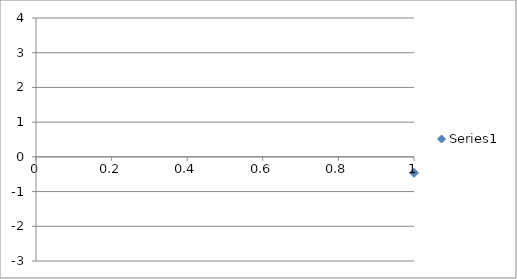
| Category | Series 0 |
|---|---|
| 0 | -0.462 |
| 1 | 0.868 |
| 2 | 0.407 |
| 3 | 1.125 |
| 4 | 1.55 |
| 5 | 0.694 |
| 6 | -1.523 |
| 7 | -0.655 |
| 8 | 1.197 |
| 9 | -0.394 |
| 10 | 1.809 |
| 11 | 0.55 |
| 12 | -0.166 |
| 13 | 0.722 |
| 14 | 0.797 |
| 15 | -1.389 |
| 16 | 0.056 |
| 17 | -1.054 |
| 18 | -0.023 |
| 19 | 0.354 |
| 20 | -0.777 |
| 21 | -1.164 |
| 22 | 0.889 |
| 23 | -0.77 |
| 24 | 0.294 |
| 25 | 0.736 |
| 26 | -0.223 |
| 27 | -1.757 |
| 28 | 0.368 |
| 29 | -0.163 |
| 30 | 1.318 |
| 31 | -1.282 |
| 32 | -0.451 |
| 33 | -1.438 |
| 34 | 0.211 |
| 35 | -0.2 |
| 36 | 3.046 |
| 37 | 0.91 |
| 38 | 0.356 |
| 39 | -1.535 |
| 40 | -0.045 |
| 41 | 0.1 |
| 42 | -0.088 |
| 43 | 1.642 |
| 44 | -1.103 |
| 45 | 0.557 |
| 46 | -0.996 |
| 47 | -0.923 |
| 48 | -0.905 |
| 49 | -0.323 |
| 50 | -0.606 |
| 51 | 0.339 |
| 52 | 0.729 |
| 53 | -0.296 |
| 54 | 1.209 |
| 55 | -2.048 |
| 56 | 1.143 |
| 57 | -0.611 |
| 58 | -0.644 |
| 59 | 0.039 |